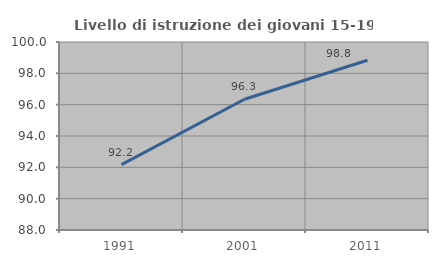
| Category | Livello di istruzione dei giovani 15-19 anni |
|---|---|
| 1991.0 | 92.177 |
| 2001.0 | 96.345 |
| 2011.0 | 98.837 |